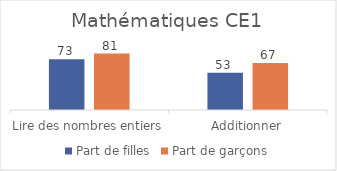
| Category | Part de filles | Part de garçons |
|---|---|---|
| Lire des nombres entiers | 72.52 | 80.65 |
| Additionner | 53.39 | 67.32 |